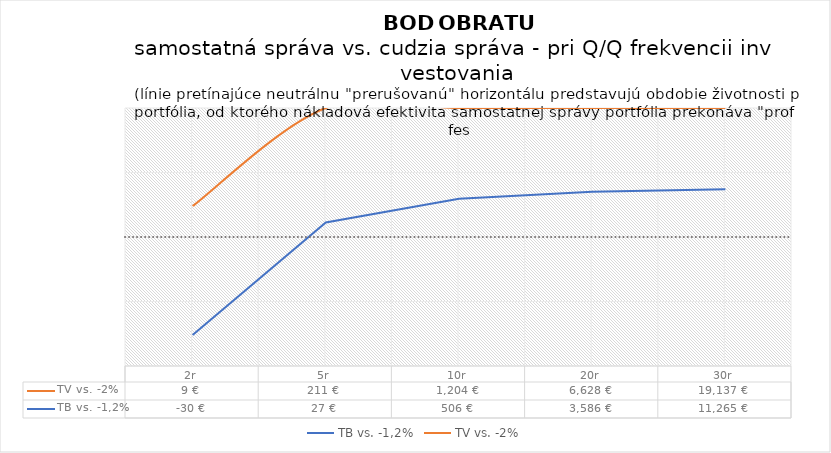
| Category | TB vs. -1,2% | TV vs. -2% |
|---|---|---|
| 2r | -29.62 | 9.346 |
| 5r | 26.742 | 211.215 |
| 10r | 506.482 | 1203.597 |
| 20r | 3585.987 | 6627.969 |
| 30r | 11265.24 | 19137.401 |